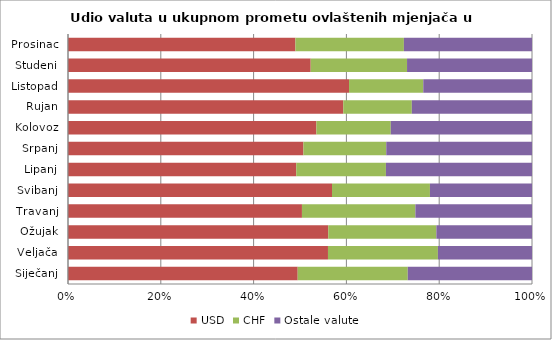
| Category | USD | CHF | Ostale valute |
|---|---|---|---|
| Siječanj | 49.506 | 23.721 | 26.774 |
| Veljača | 56.029 | 23.694 | 20.277 |
| Ožujak | 56.092 | 23.294 | 20.613 |
| Travanj | 50.419 | 24.448 | 25.133 |
| Svibanj | 56.898 | 21.105 | 21.997 |
| Lipanj | 49.197 | 19.321 | 31.482 |
| Srpanj | 50.739 | 17.851 | 31.41 |
| Kolovoz | 53.531 | 16.034 | 30.435 |
| Rujan | 59.324 | 14.775 | 25.901 |
| Listopad | 60.567 | 16.001 | 23.433 |
| Studeni | 52.307 | 20.763 | 26.93 |
| Prosinac | 49.011 | 23.38 | 27.61 |